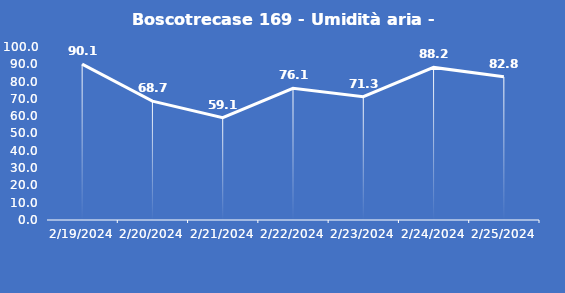
| Category | Boscotrecase 169 - Umidità aria - Grezzo (%) |
|---|---|
| 2/19/24 | 90.1 |
| 2/20/24 | 68.7 |
| 2/21/24 | 59.1 |
| 2/22/24 | 76.1 |
| 2/23/24 | 71.3 |
| 2/24/24 | 88.2 |
| 2/25/24 | 82.8 |